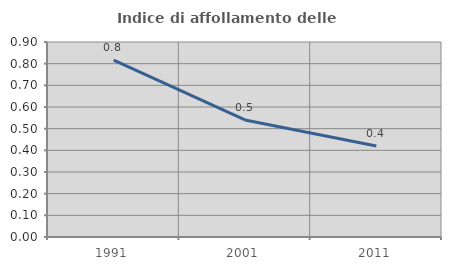
| Category | Indice di affollamento delle abitazioni  |
|---|---|
| 1991.0 | 0.816 |
| 2001.0 | 0.54 |
| 2011.0 | 0.42 |